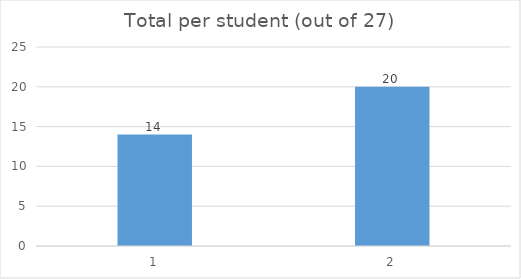
| Category | Total |
|---|---|
| 0 | 14 |
| 1 | 20 |